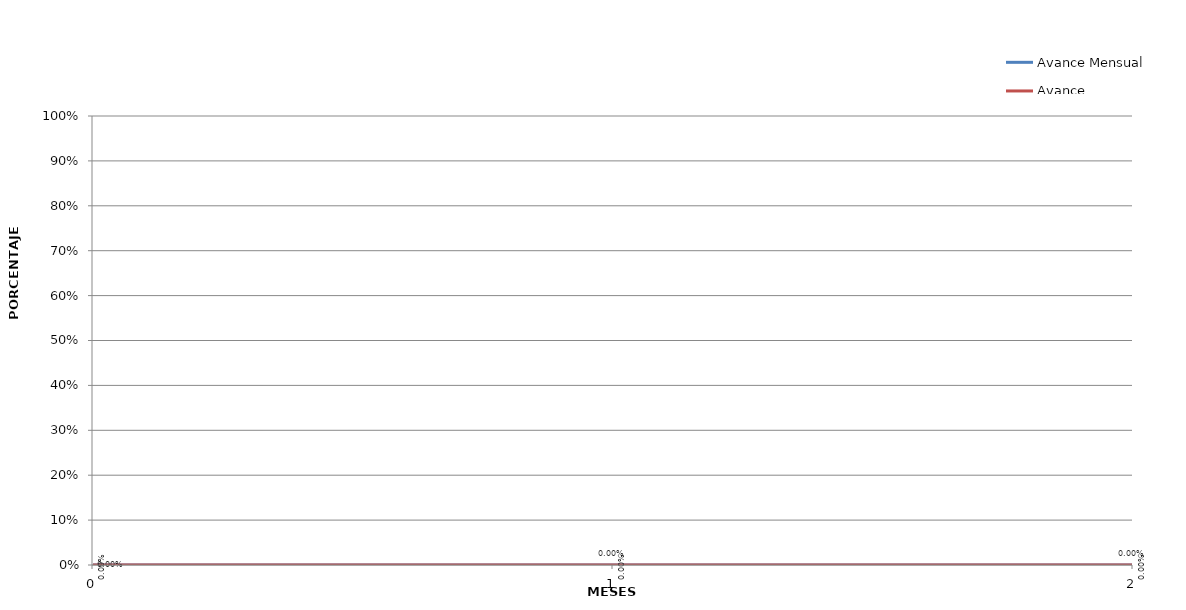
| Category | Avance Mensual | Avance Acumulado |
|---|---|---|
| 0.0 | 0 | 0 |
| 1.0 | 0 | 0 |
| 2.0 | 0 | 0 |